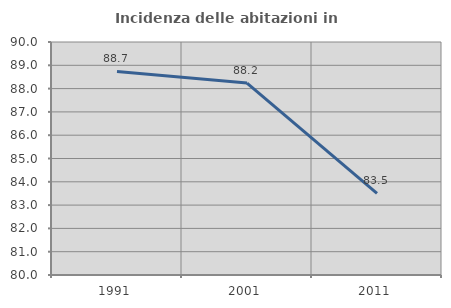
| Category | Incidenza delle abitazioni in proprietà  |
|---|---|
| 1991.0 | 88.737 |
| 2001.0 | 88.235 |
| 2011.0 | 83.505 |